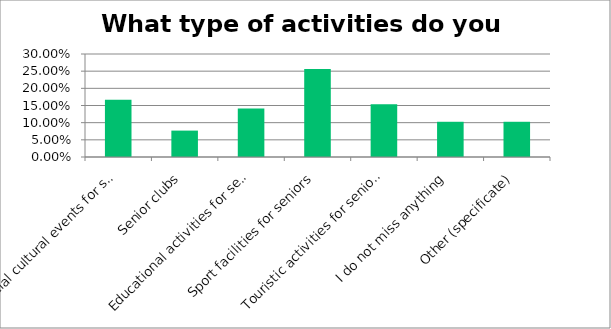
| Category | Responses |
|---|---|
| Special cultural events for seniors  | 0.167 |
| Senior clubs | 0.077 |
| Educational activities for seniors  | 0.141 |
| Sport facilities for seniors | 0.256 |
| Touristic activities for seniors  | 0.154 |
| I do not miss anything | 0.103 |
| Other (specificate) | 0.103 |